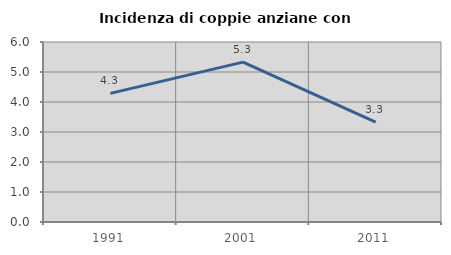
| Category | Incidenza di coppie anziane con figli |
|---|---|
| 1991.0 | 4.288 |
| 2001.0 | 5.33 |
| 2011.0 | 3.325 |